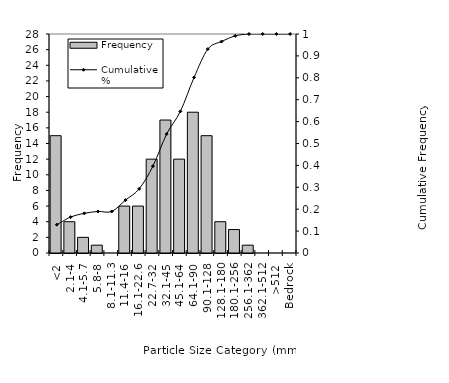
| Category | Frequency |
|---|---|
| <2 | 15 |
| 2.1-4 | 4 |
| 4.1-5.7 | 2 |
| 5.8-8 | 1 |
| 8.1-11.3 | 0 |
| 11.4-16 | 6 |
| 16.1-22.6 | 6 |
| 22.7-32 | 12 |
| 32.1-45 | 17 |
| 45.1-64 | 12 |
| 64.1-90 | 18 |
| 90.1-128 | 15 |
| 128.1-180 | 4 |
| 180.1-256 | 3 |
| 256.1-362 | 1 |
| 362.1-512 | 0 |
| >512 | 0 |
| Bedrock | 0 |